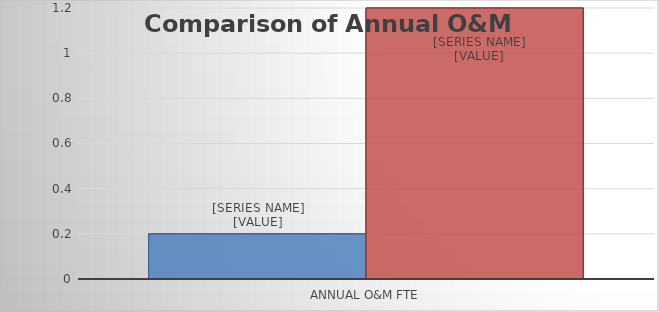
| Category | Option 1 | Option 2 |
|---|---|---|
| Annual O&M FTE | 0.2 | 1.2 |